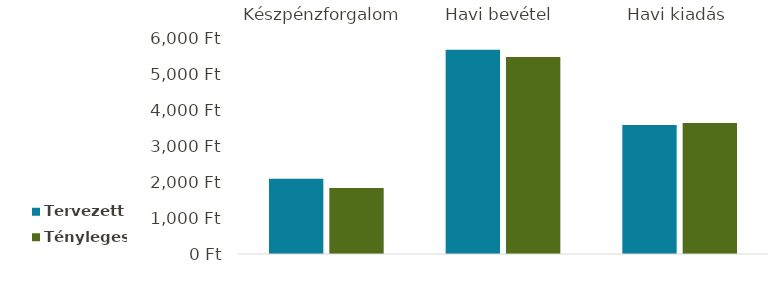
| Category | Tervezett | Tényleges |
|---|---|---|
| Készpénzforgalom | 2097 | 1845 |
| Havi bevétel | 5700 | 5500 |
| Havi kiadás | 3603 | 3655 |